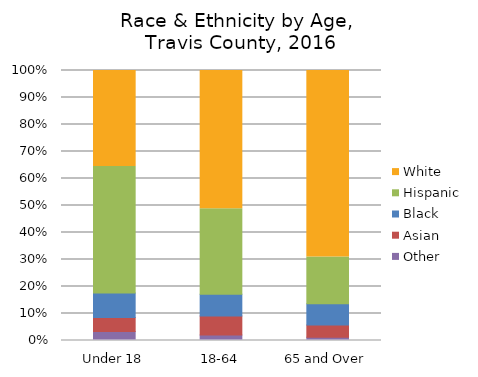
| Category | Other | Asian | Black | Hispanic | White |
|---|---|---|---|---|---|
| Under 18 | 0.033 | 0.052 | 0.09 | 0.469 | 0.355 |
| 18-64 | 0.02 | 0.07 | 0.081 | 0.317 | 0.512 |
| 65 and Over | 0.012 | 0.045 | 0.079 | 0.173 | 0.691 |